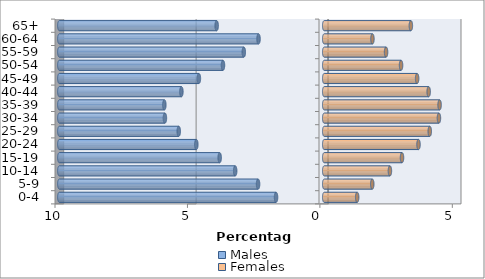
| Category | Males | Females |
|---|---|---|
| 0-4 | -1.819 | 1.244 |
| 5-9 | -2.497 | 1.814 |
| 10-14 | -3.361 | 2.48 |
| 15-19 | -3.947 | 2.937 |
| 20-24 | -4.829 | 3.559 |
| 25-29 | -5.492 | 3.984 |
| 30-34 | -6.015 | 4.331 |
| 35-39 | -6.036 | 4.356 |
| 40-44 | -5.392 | 3.943 |
| 45-49 | -4.732 | 3.507 |
| 50-54 | -3.822 | 2.901 |
| 55-59 | -3.036 | 2.335 |
| 60-64 | -2.48 | 1.82 |
| 65+ | -4.061 | 3.271 |